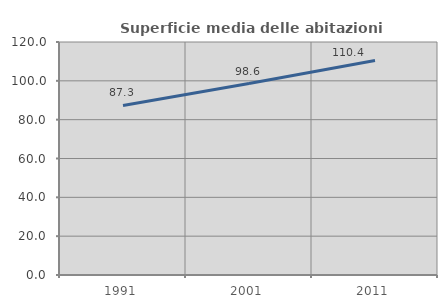
| Category | Superficie media delle abitazioni occupate |
|---|---|
| 1991.0 | 87.331 |
| 2001.0 | 98.625 |
| 2011.0 | 110.421 |